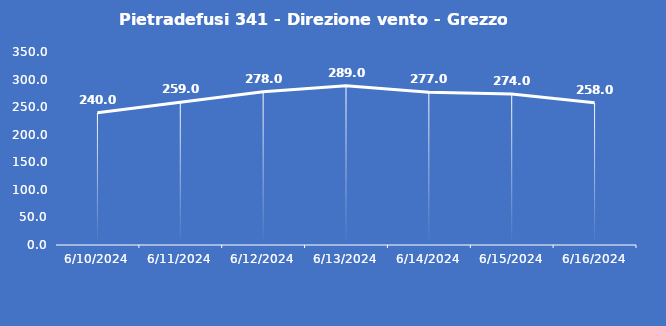
| Category | Pietradefusi 341 - Direzione vento - Grezzo (°N) |
|---|---|
| 6/10/24 | 240 |
| 6/11/24 | 259 |
| 6/12/24 | 278 |
| 6/13/24 | 289 |
| 6/14/24 | 277 |
| 6/15/24 | 274 |
| 6/16/24 | 258 |